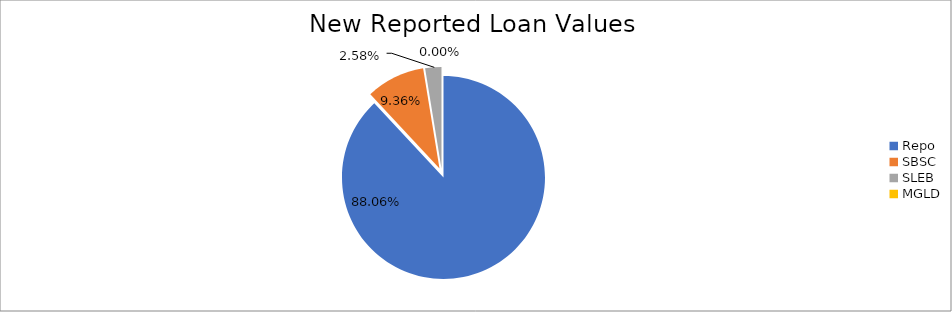
| Category | Series 0 |
|---|---|
| Repo | 10325574.227 |
| SBSC | 1096982.39 |
| SLEB | 303033.705 |
| MGLD | 146.493 |